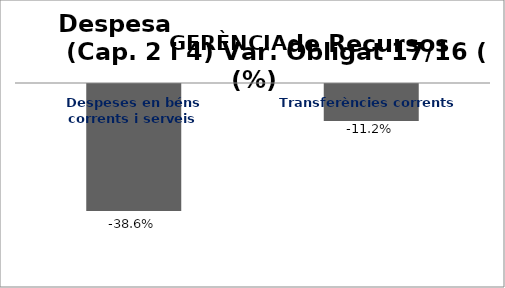
| Category | Series 0 |
|---|---|
| Despeses en béns corrents i serveis | -0.386 |
| Transferències corrents | -0.112 |